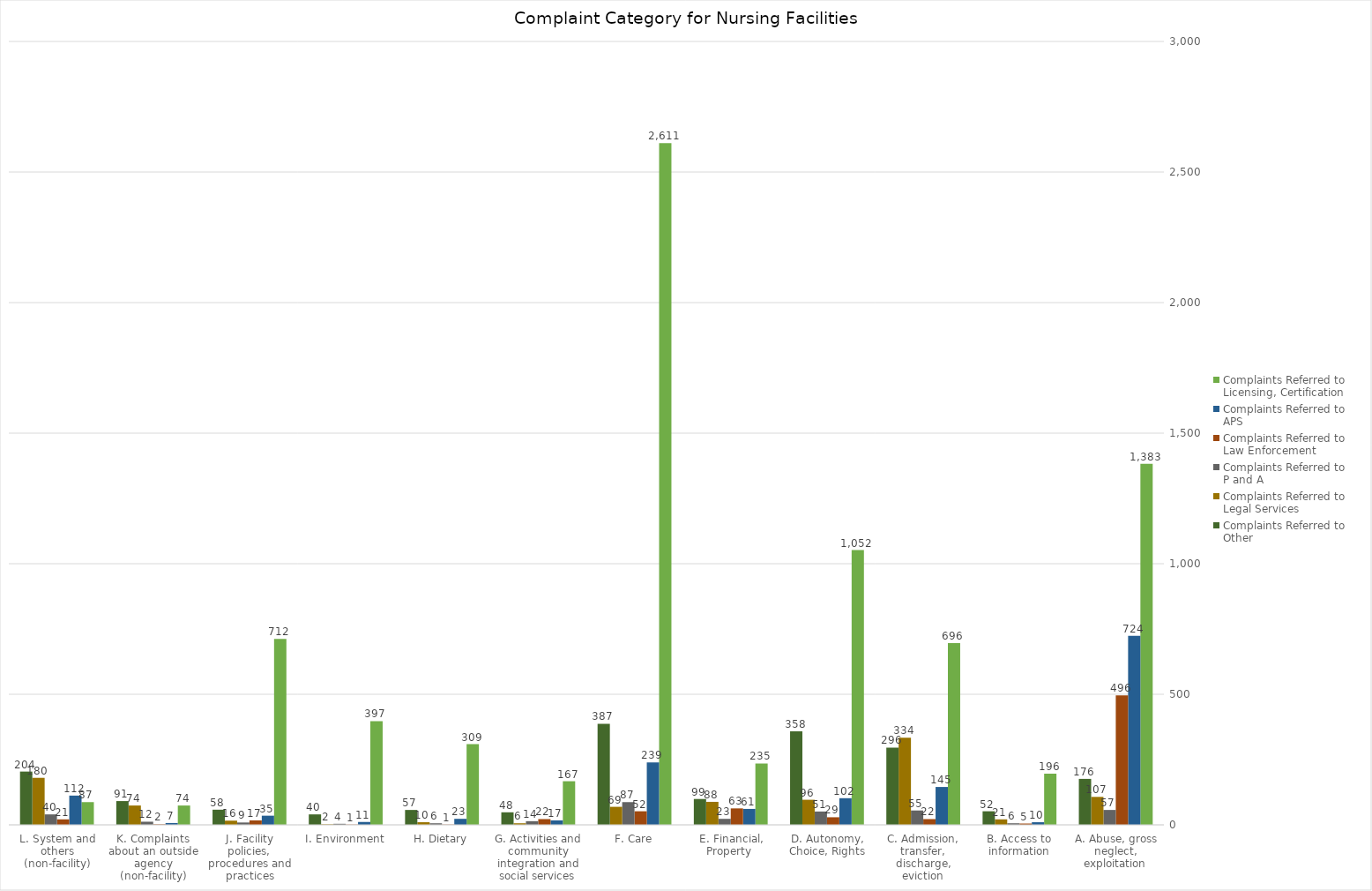
| Category | Complaints Referred to 
Licensing, Certification  | Complaints Referred to 
APS | Complaints Referred to 
Law Enforcement | Complaints Referred to 
P and A | Complaints Referred to 
Legal Services | Complaints Referred to 
Other |
|---|---|---|---|---|---|---|
| A. Abuse, gross neglect, exploitation | 1383 | 724 | 496 | 57 | 107 | 176 |
| B. Access to information | 196 | 10 | 5 | 6 | 21 | 52 |
| C. Admission, transfer, discharge, eviction | 696 | 145 | 22 | 55 | 334 | 296 |
| D. Autonomy, Choice, Rights | 1052 | 102 | 29 | 51 | 96 | 358 |
| E. Financial, Property  | 235 | 61 | 63 | 23 | 88 | 99 |
| F. Care | 2611 | 239 | 52 | 87 | 69 | 387 |
| G. Activities and community integration and social services | 167 | 17 | 22 | 14 | 6 | 48 |
| H. Dietary | 309 | 23 | 1 | 6 | 10 | 57 |
| I. Environment | 397 | 11 | 1 | 4 | 2 | 40 |
| J. Facility policies, procedures and practices | 712 | 35 | 17 | 9 | 16 | 58 |
| K. Complaints about an outside agency (non-facility) | 74 | 7 | 2 | 12 | 74 | 91 |
| L. System and others (non-facility) | 87 | 112 | 21 | 40 | 180 | 204 |